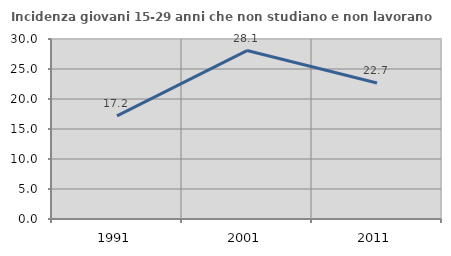
| Category | Incidenza giovani 15-29 anni che non studiano e non lavorano  |
|---|---|
| 1991.0 | 17.176 |
| 2001.0 | 28.073 |
| 2011.0 | 22.674 |